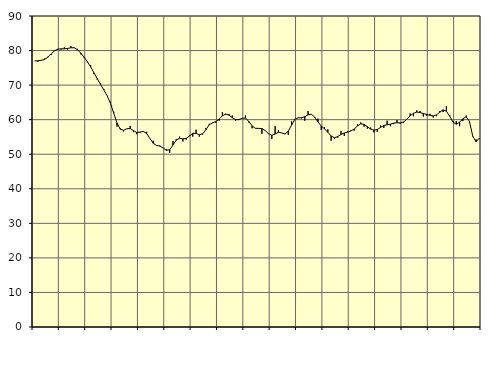
| Category | Piggar | Series 1 |
|---|---|---|
| nan | 77 | 77.01 |
| 87.0 | 76.8 | 77.05 |
| 87.0 | 77.1 | 77.18 |
| 87.0 | 77.7 | 77.41 |
| nan | 78.2 | 78.04 |
| 88.0 | 78.7 | 78.99 |
| 88.0 | 80.1 | 79.9 |
| 88.0 | 80.2 | 80.42 |
| nan | 80.3 | 80.49 |
| 89.0 | 80.9 | 80.5 |
| 89.0 | 80.3 | 80.61 |
| 89.0 | 81.3 | 80.8 |
| nan | 80.9 | 80.8 |
| 90.0 | 80.5 | 80.25 |
| 90.0 | 78.9 | 79.25 |
| 90.0 | 77.9 | 78.09 |
| nan | 76.6 | 76.79 |
| 91.0 | 75.8 | 75.27 |
| 91.0 | 73.2 | 73.56 |
| 91.0 | 71.6 | 71.87 |
| nan | 70.5 | 70.22 |
| 92.0 | 68.9 | 68.61 |
| 92.0 | 67 | 66.95 |
| 92.0 | 65.2 | 64.77 |
| nan | 62.3 | 61.89 |
| 93.0 | 58 | 59.05 |
| 93.0 | 57.5 | 57.22 |
| 93.0 | 56.6 | 56.93 |
| nan | 57.4 | 57.37 |
| 94.0 | 58.2 | 57.44 |
| 94.0 | 56.4 | 56.85 |
| 94.0 | 55.8 | 56.27 |
| nan | 56.2 | 56.4 |
| 95.0 | 56.5 | 56.61 |
| 95.0 | 56.5 | 56.01 |
| 95.0 | 54.6 | 54.56 |
| nan | 53.9 | 53.17 |
| 96.0 | 52.5 | 52.55 |
| 96.0 | 52.5 | 52.34 |
| 96.0 | 51.8 | 51.81 |
| nan | 51.4 | 51.13 |
| 97.0 | 50.4 | 51.31 |
| 97.0 | 53.8 | 52.66 |
| 97.0 | 54.4 | 54.11 |
| nan | 55.1 | 54.59 |
| 98.0 | 53.7 | 54.44 |
| 98.0 | 54.2 | 54.58 |
| 98.0 | 55.5 | 55.27 |
| nan | 55.1 | 56.06 |
| 99.0 | 57.1 | 56.03 |
| 99.0 | 55.1 | 55.64 |
| 99.0 | 55.7 | 55.92 |
| nan | 57.6 | 57.13 |
| 0.0 | 58.8 | 58.52 |
| 0.0 | 59 | 59.09 |
| 0.0 | 59.1 | 59.46 |
| nan | 59.7 | 60.18 |
| 1.0 | 62.2 | 61.11 |
| 1.0 | 61.5 | 61.64 |
| 1.0 | 61.6 | 61.3 |
| nan | 61.2 | 60.58 |
| 2.0 | 59.7 | 60.04 |
| 2.0 | 60.2 | 60 |
| 2.0 | 60.3 | 60.44 |
| nan | 61.2 | 60.44 |
| 3.0 | 59.2 | 59.51 |
| 3.0 | 57.5 | 58.22 |
| 3.0 | 57.5 | 57.49 |
| nan | 57.4 | 57.48 |
| 4.0 | 55.9 | 57.42 |
| 4.0 | 56.9 | 56.83 |
| 4.0 | 56 | 55.95 |
| nan | 54.4 | 55.49 |
| 5.0 | 58.1 | 55.84 |
| 5.0 | 57 | 56.36 |
| 5.0 | 56.2 | 56.16 |
| nan | 55.8 | 55.86 |
| 6.0 | 55.6 | 56.66 |
| 6.0 | 59.5 | 58.44 |
| 6.0 | 60 | 60.06 |
| nan | 60.6 | 60.56 |
| 7.0 | 60.4 | 60.55 |
| 7.0 | 59.7 | 60.88 |
| 7.0 | 62.5 | 61.4 |
| nan | 61.5 | 61.57 |
| 8.0 | 60.5 | 60.75 |
| 8.0 | 60.3 | 59.36 |
| 8.0 | 57 | 58.18 |
| nan | 57.9 | 57.31 |
| 9.0 | 57.2 | 56.37 |
| 9.0 | 53.9 | 55.28 |
| 9.0 | 54.4 | 54.77 |
| nan | 54.8 | 55.13 |
| 10.0 | 56.7 | 55.7 |
| 10.0 | 55.3 | 56.14 |
| 10.0 | 56.6 | 56.39 |
| nan | 56.9 | 56.72 |
| 11.0 | 56.8 | 57.3 |
| 11.0 | 58.7 | 58.18 |
| 11.0 | 59.2 | 58.8 |
| nan | 58 | 58.63 |
| 12.0 | 57.4 | 57.98 |
| 12.0 | 57.7 | 57.27 |
| 12.0 | 56.3 | 56.97 |
| nan | 56.5 | 57.14 |
| 13.0 | 58.3 | 57.76 |
| 13.0 | 57.6 | 58.34 |
| 13.0 | 59.7 | 58.51 |
| nan | 58.1 | 58.71 |
| 14.0 | 58.7 | 59 |
| 14.0 | 59.9 | 59.12 |
| 14.0 | 58.8 | 59.07 |
| nan | 59 | 59.34 |
| 15.0 | 60.2 | 60.15 |
| 15.0 | 61.8 | 61.11 |
| 15.0 | 61 | 61.84 |
| nan | 62.7 | 62.19 |
| 16.0 | 62.5 | 62.07 |
| 16.0 | 60.9 | 61.77 |
| 16.0 | 61.1 | 61.54 |
| nan | 61.7 | 61.26 |
| 17.0 | 60.6 | 61.1 |
| 17.0 | 61 | 61.38 |
| 17.0 | 62.5 | 62.17 |
| nan | 62.2 | 62.85 |
| 18.0 | 63.9 | 62.45 |
| 18.0 | 61.2 | 60.97 |
| 18.0 | 59.6 | 59.33 |
| nan | 59.6 | 58.67 |
| 19.0 | 58.1 | 59.25 |
| 19.0 | 59.6 | 60.26 |
| 19.0 | 61.2 | 60.83 |
| nan | 59.2 | 59.48 |
| 20.0 | 55.1 | 55.23 |
| 20.0 | 54.3 | 53.59 |
| 20.0 | 54.5 | 54.65 |